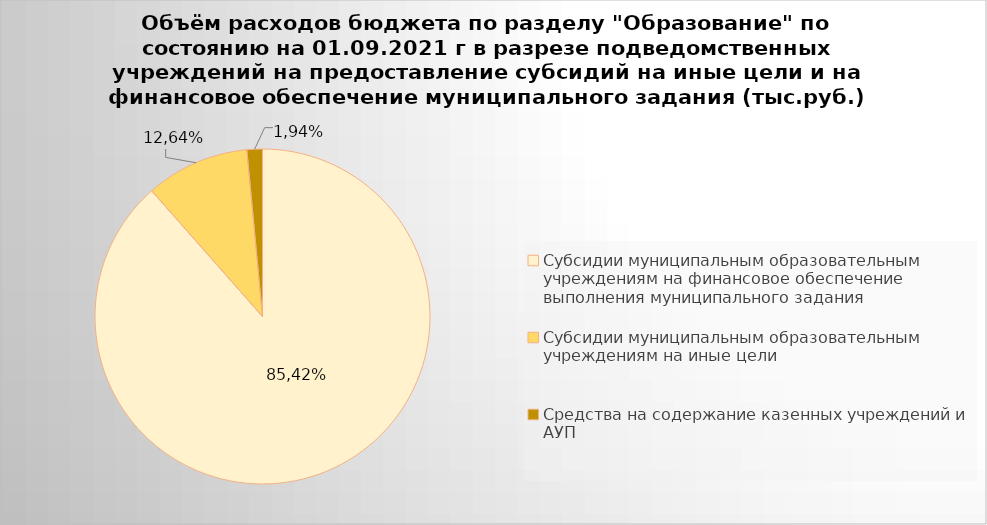
| Category | Series 0 |
|---|---|
| Субсидии муниципальным образовательным учреждениям на финансовое обеспечение выполнения муниципального задания | 6051295.16 |
| Субсидии муниципальным образовательным учреждениям на иные цели | 684458.93 |
| Средства на содержание казенных учреждений и АУП | 102035.01 |